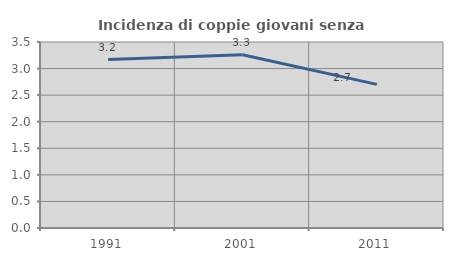
| Category | Incidenza di coppie giovani senza figli |
|---|---|
| 1991.0 | 3.17 |
| 2001.0 | 3.261 |
| 2011.0 | 2.702 |